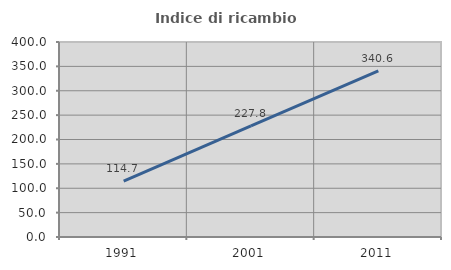
| Category | Indice di ricambio occupazionale  |
|---|---|
| 1991.0 | 114.706 |
| 2001.0 | 227.778 |
| 2011.0 | 340.625 |